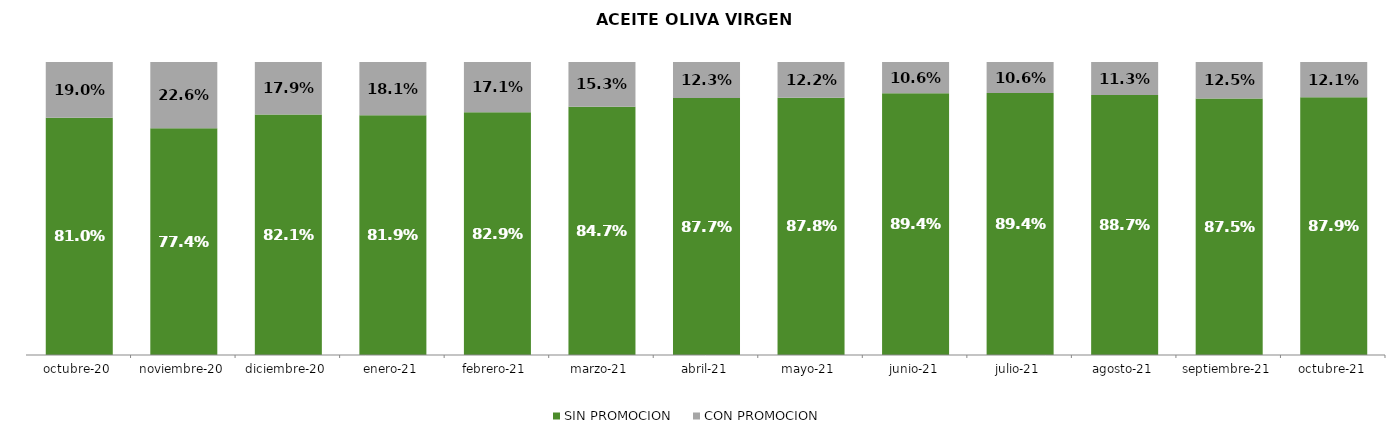
| Category | SIN PROMOCION   | CON PROMOCION   |
|---|---|---|
| 2020-10-01 | 0.81 | 0.19 |
| 2020-11-01 | 0.774 | 0.226 |
| 2020-12-01 | 0.821 | 0.179 |
| 2021-01-01 | 0.819 | 0.181 |
| 2021-02-01 | 0.829 | 0.171 |
| 2021-03-01 | 0.847 | 0.153 |
| 2021-04-01 | 0.877 | 0.123 |
| 2021-05-01 | 0.878 | 0.122 |
| 2021-06-01 | 0.894 | 0.106 |
| 2021-07-01 | 0.894 | 0.106 |
| 2021-08-01 | 0.887 | 0.113 |
| 2021-09-01 | 0.875 | 0.125 |
| 2021-10-01 | 0.879 | 0.121 |